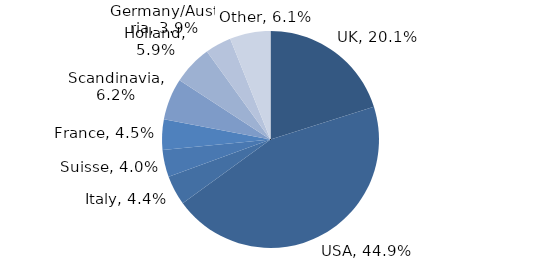
| Category | Investment Style |
|---|---|
| UK | 0.201 |
| USA | 0.449 |
| Italy | 0.044 |
| Suisse | 0.04 |
| France | 0.045 |
| Scandinavia | 0.062 |
| Holland | 0.059 |
| Germany/Austria | 0.039 |
| Other | 0.061 |